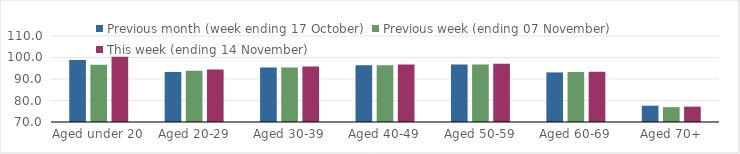
| Category | Previous month (week ending 17 October) | Previous week (ending 07 November) | This week (ending 14 November) |
|---|---|---|---|
| Aged under 20 | 98.84 | 96.64 | 100.35 |
| Aged 20-29 | 93.28 | 93.87 | 94.4 |
| Aged 30-39 | 95.39 | 95.39 | 95.79 |
| Aged 40-49 | 96.41 | 96.45 | 96.75 |
| Aged 50-59 | 96.79 | 96.73 | 97.04 |
| Aged 60-69 | 93.06 | 93.24 | 93.36 |
| Aged 70+ | 77.58 | 76.9 | 77.14 |